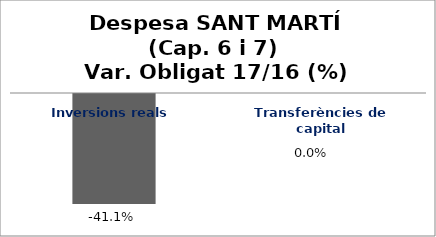
| Category | Series 0 |
|---|---|
| Inversions reals | -0.411 |
| Transferències de capital | 0 |